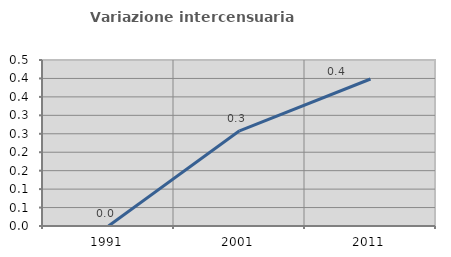
| Category | Variazione intercensuaria annua |
|---|---|
| 1991.0 | 0 |
| 2001.0 | 0.258 |
| 2011.0 | 0.399 |